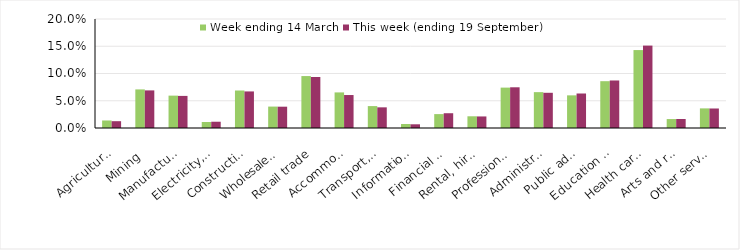
| Category | Week ending 14 March | This week (ending 19 September) |
|---|---|---|
| Agriculture, forestry and fishing | 0.014 | 0.012 |
| Mining | 0.071 | 0.069 |
| Manufacturing | 0.059 | 0.059 |
| Electricity, gas, water and waste services | 0.011 | 0.012 |
| Construction | 0.069 | 0.067 |
| Wholesale trade | 0.039 | 0.039 |
| Retail trade | 0.095 | 0.094 |
| Accommodation and food services | 0.065 | 0.06 |
| Transport, postal and warehousing | 0.04 | 0.038 |
| Information media and telecommunications | 0.007 | 0.007 |
| Financial and insurance services | 0.026 | 0.027 |
| Rental, hiring and real estate services | 0.022 | 0.021 |
| Professional, scientific and technical services | 0.074 | 0.075 |
| Administrative and support services | 0.066 | 0.065 |
| Public administration and safety | 0.06 | 0.063 |
| Education and training | 0.086 | 0.087 |
| Health care and social assistance | 0.143 | 0.151 |
| Arts and recreation services | 0.016 | 0.016 |
| Other services | 0.036 | 0.036 |